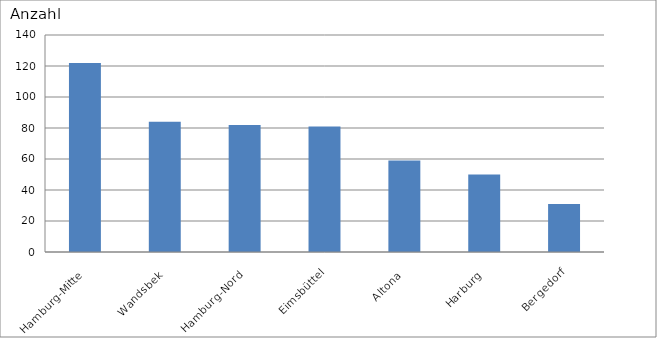
| Category | Hamburg-Mitte |
|---|---|
| Hamburg-Mitte | 122 |
| Wandsbek | 84 |
| Hamburg-Nord | 82 |
| Eimsbüttel | 81 |
| Altona | 59 |
| Harburg | 50 |
| Bergedorf | 31 |